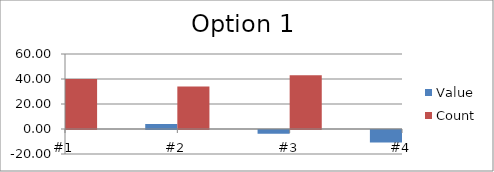
| Category | Value | Count |
|---|---|---|
| #1 | 10 | 40 |
| #2 | 4 | 34 |
| #3 | -3 | 43 |
| #4 | -10 | 41 |